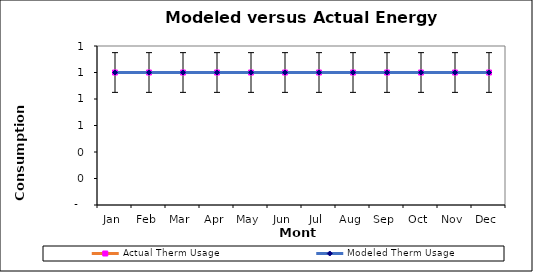
| Category | Actual Therm Usage | Modeled Therm Usage |
|---|---|---|
| 0 | 1 | 1 |
| 1900-01-01 | 1 | 1 |
| 1900-01-02 | 1 | 1 |
| 1900-01-03 | 1 | 1 |
| 1900-01-04 | 1 | 1 |
| 1900-01-05 | 1 | 1 |
| 1900-01-06 | 1 | 1 |
| 1900-01-07 | 1 | 1 |
| 1900-01-08 | 1 | 1 |
| 1900-01-09 | 1 | 1 |
| 1900-01-10 | 1 | 1 |
| 1900-01-11 | 1 | 1 |